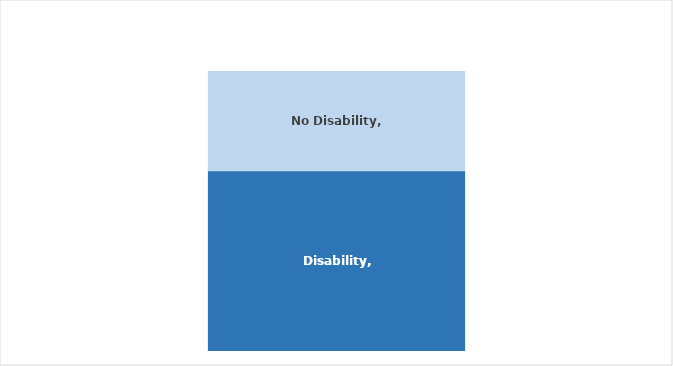
| Category | Disability | No Disability |
|---|---|---|
| Clackmannanshire | 0.645 | 0.355 |